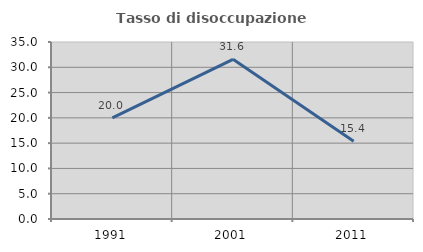
| Category | Tasso di disoccupazione giovanile  |
|---|---|
| 1991.0 | 20 |
| 2001.0 | 31.579 |
| 2011.0 | 15.385 |